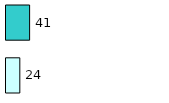
| Category | Series 0 | Series 1 |
|---|---|---|
| 0 | 24 | 41 |